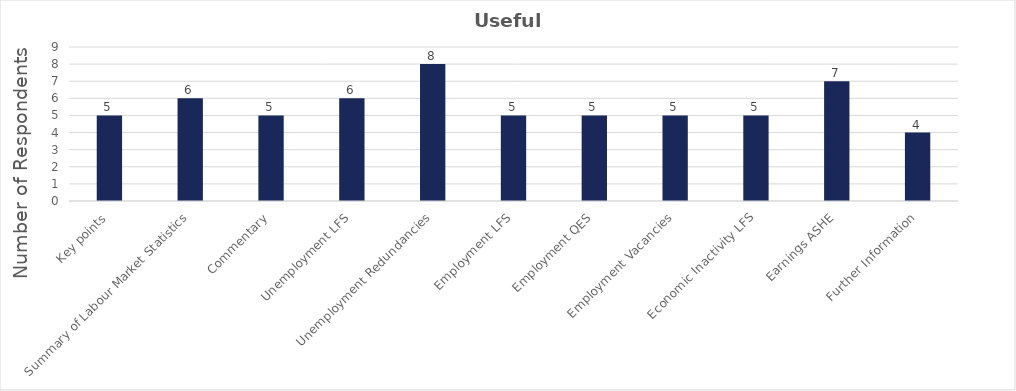
| Category | Useful |
|---|---|
| Key points | 5 |
| Summary of Labour Market Statistics | 6 |
| Commentary | 5 |
| Unemployment LFS | 6 |
| Unemployment Redundancies | 8 |
| Employment LFS | 5 |
| Employment QES | 5 |
| Employment Vacancies | 5 |
| Economic Inactivity LFS | 5 |
| Earnings ASHE | 7 |
| Further Information | 4 |